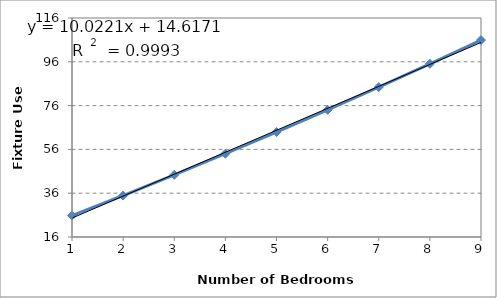
| Category | Series 0 |
|---|---|
| 1.0 | 25.761 |
| 2.0 | 34.942 |
| 3.0 | 44.363 |
| 4.0 | 54.024 |
| 5.0 | 63.926 |
| 6.0 | 74.068 |
| 7.0 | 84.451 |
| 8.0 | 95.074 |
| 9.0 | 105.938 |